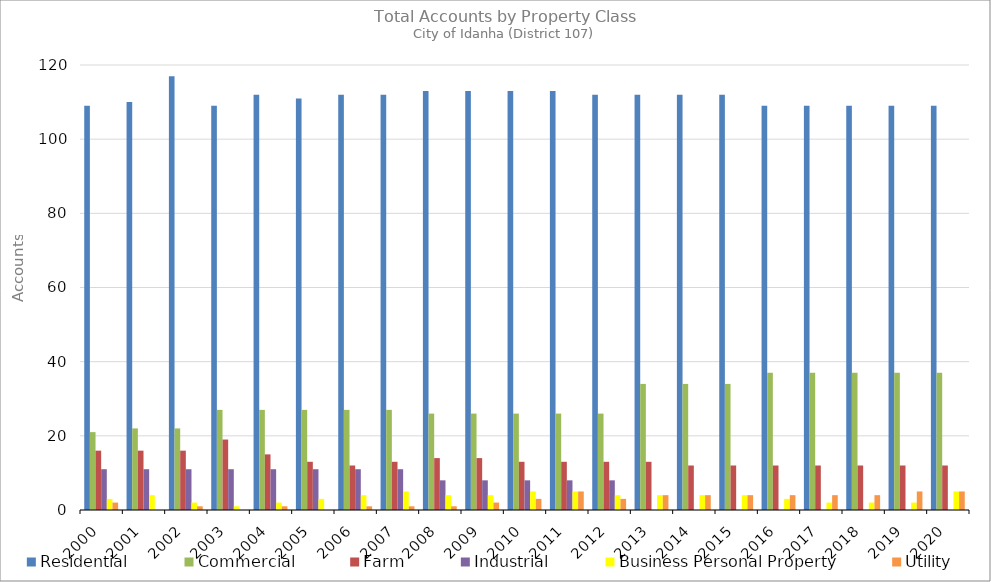
| Category | Residential | Commercial | Farm | Industrial | Business Personal Property | Utility |
|---|---|---|---|---|---|---|
| 2000.0 | 109 | 21 | 16 | 11 | 3 | 2 |
| 2001.0 | 110 | 22 | 16 | 11 | 4 | 0 |
| 2002.0 | 117 | 22 | 16 | 11 | 2 | 1 |
| 2003.0 | 109 | 27 | 19 | 11 | 1 | 0 |
| 2004.0 | 112 | 27 | 15 | 11 | 2 | 1 |
| 2005.0 | 111 | 27 | 13 | 11 | 3 | 0 |
| 2006.0 | 112 | 27 | 12 | 11 | 4 | 1 |
| 2007.0 | 112 | 27 | 13 | 11 | 5 | 1 |
| 2008.0 | 113 | 26 | 14 | 8 | 4 | 1 |
| 2009.0 | 113 | 26 | 14 | 8 | 4 | 2 |
| 2010.0 | 113 | 26 | 13 | 8 | 5 | 3 |
| 2011.0 | 113 | 26 | 13 | 8 | 5 | 5 |
| 2012.0 | 112 | 26 | 13 | 8 | 4 | 3 |
| 2013.0 | 112 | 34 | 13 | 0 | 4 | 4 |
| 2014.0 | 112 | 34 | 12 | 0 | 4 | 4 |
| 2015.0 | 112 | 34 | 12 | 0 | 4 | 4 |
| 2016.0 | 109 | 37 | 12 | 0 | 3 | 4 |
| 2017.0 | 109 | 37 | 12 | 0 | 2 | 4 |
| 2018.0 | 109 | 37 | 12 | 0 | 2 | 4 |
| 2019.0 | 109 | 37 | 12 | 0 | 2 | 5 |
| 2020.0 | 109 | 37 | 12 | 0 | 5 | 5 |